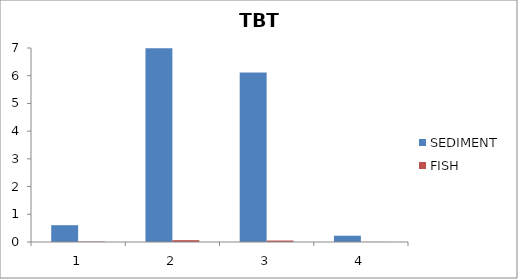
| Category | SEDIMENT | FISH |
|---|---|---|
| 0 | 0.607 | 0.017 |
| 1 | 6.987 | 0.067 |
| 2 | 6.117 | 0.053 |
| 3 | 0.227 | 0.003 |